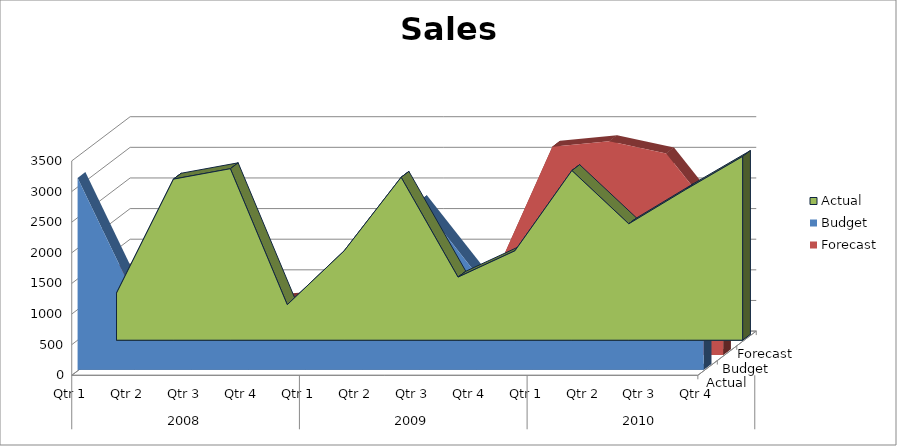
| Category | Actual | Budget | Forecast |
|---|---|---|---|
| 0 | 770 | 3130 | 1350 |
| 1 | 2630 | 1200 | 1450 |
| 2 | 2800 | 2530 | 1410 |
| 3 | 580 | 1450 | 890 |
| 4 | 1460 | 520 | 960 |
| 5 | 2660 | 780 | 1960 |
| 6 | 1030 | 2750 | 1070 |
| 7 | 1460 | 1570 | 1320 |
| 8 | 2770 | 1930 | 3400 |
| 9 | 1900 | 1180 | 3490 |
| 10 | 2460 | 1530 | 3290 |
| 11 | 3000 | 610 | 2120 |